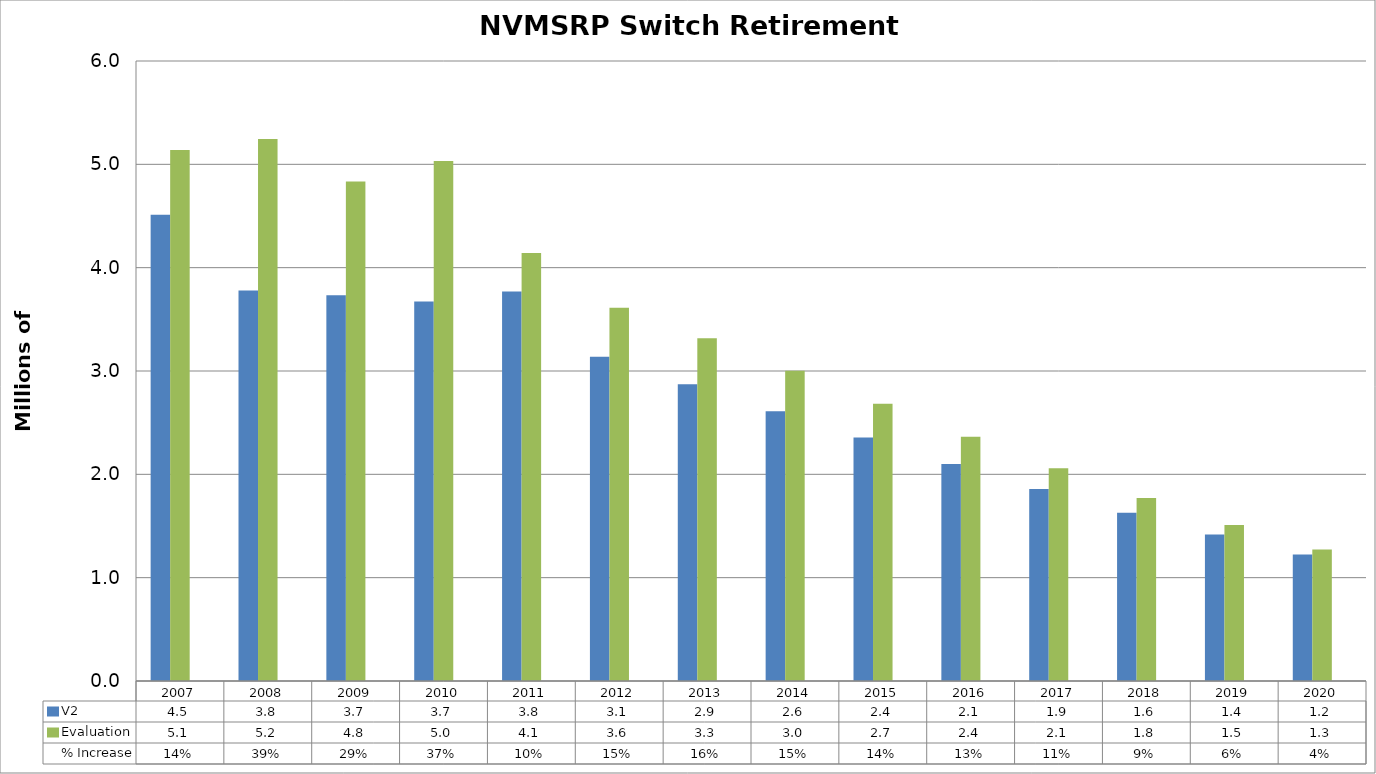
| Category | V2 | Evaluation | % Increase |
|---|---|---|---|
| 2007.0 | 4.513 | 5.139 | 0.139 |
| 2008.0 | 3.779 | 5.246 | 0.388 |
| 2009.0 | 3.734 | 4.835 | 0.295 |
| 2010.0 | 3.672 | 5.032 | 0.37 |
| 2011.0 | 3.769 | 4.141 | 0.099 |
| 2012.0 | 3.137 | 3.613 | 0.152 |
| 2013.0 | 2.872 | 3.318 | 0.155 |
| 2014.0 | 2.61 | 3.003 | 0.151 |
| 2015.0 | 2.356 | 2.683 | 0.139 |
| 2016.0 | 2.099 | 2.364 | 0.126 |
| 2017.0 | 1.857 | 2.058 | 0.108 |
| 2018.0 | 1.629 | 1.771 | 0.087 |
| 2019.0 | 1.418 | 1.509 | 0.064 |
| 2020.0 | 1.223 | 1.272 | 0.04 |